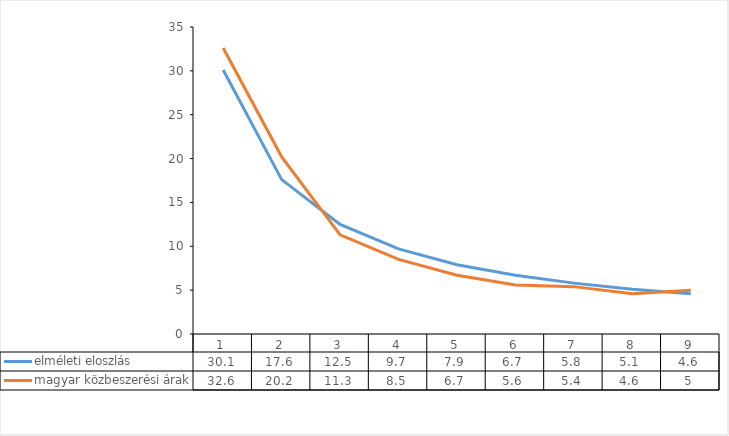
| Category | elméleti eloszlás | magyar közbeszerési árak |
|---|---|---|
| 1.0 | 30.1 | 32.6 |
| 2.0 | 17.6 | 20.2 |
| 3.0 | 12.5 | 11.3 |
| 4.0 | 9.7 | 8.5 |
| 5.0 | 7.9 | 6.7 |
| 6.0 | 6.7 | 5.6 |
| 7.0 | 5.8 | 5.4 |
| 8.0 | 5.1 | 4.6 |
| 9.0 | 4.6 | 5 |